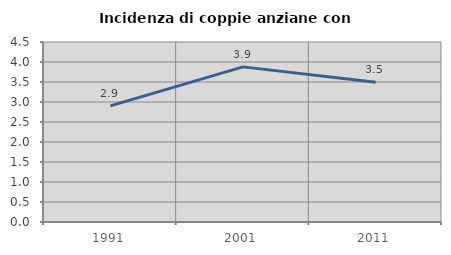
| Category | Incidenza di coppie anziane con figli |
|---|---|
| 1991.0 | 2.903 |
| 2001.0 | 3.878 |
| 2011.0 | 3.492 |